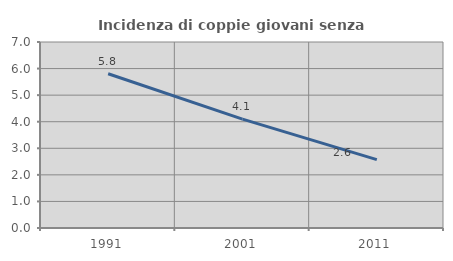
| Category | Incidenza di coppie giovani senza figli |
|---|---|
| 1991.0 | 5.806 |
| 2001.0 | 4.096 |
| 2011.0 | 2.574 |